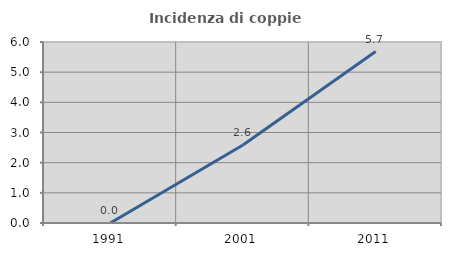
| Category | Incidenza di coppie miste |
|---|---|
| 1991.0 | 0 |
| 2001.0 | 2.586 |
| 2011.0 | 5.682 |